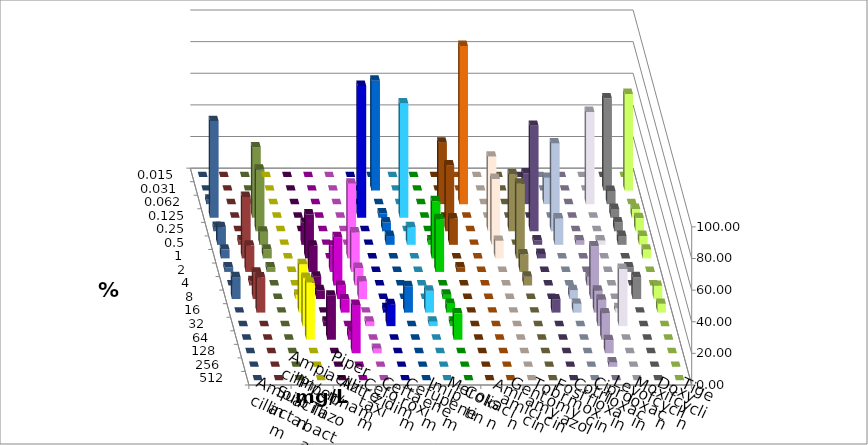
| Category | Ampicillin | Ampicillin/ Sulbactam | Piperacillin | Piperacillin/ Tazobactam | Aztreonam | Cefotaxim | Ceftazidim | Cefuroxim | Imipenem | Meropenem | Colistin | Amikacin | Gentamicin | Tobramycin | Fosfomycin | Cotrimoxazol | Ciprofloxacin | Levofloxacin | Moxifloxacin | Doxycyclin | Tigecyclin |
|---|---|---|---|---|---|---|---|---|---|---|---|---|---|---|---|---|---|---|---|---|---|
| 0.015 | 0 | 0 | 0 | 0 | 0 | 0 | 0 | 0 | 0 | 0 | 0 | 0 | 0 | 0 | 0 | 0 | 0 | 0 | 0 | 0 | 0 |
| 0.031 | 0 | 0 | 0 | 0 | 0 | 69.444 | 0 | 0 | 0 | 0 | 0 | 0 | 0 | 0 | 0 | 0 | 58.333 | 61.111 | 0 | 0 | 0 |
| 0.062 | 0 | 0 | 0 | 0 | 0 | 0 | 0 | 0 | 38.889 | 100 | 0 | 0 | 19.444 | 16.667 | 0 | 58.333 | 8.333 | 0 | 2.778 | 0 | 0 |
| 0.125 | 0 | 0 | 0 | 0 | 83.333 | 2.778 | 72.222 | 0 | 0 | 0 | 0 | 0 | 0 | 0 | 0 | 0 | 5.556 | 5.556 | 61.111 | 0 | 44.444 |
| 0.25 | 0 | 0 | 0 | 0 | 0 | 5.556 | 0 | 0 | 41.667 | 0 | 47.222 | 36.111 | 66.667 | 55.556 | 0 | 0 | 5.556 | 8.333 | 2.778 | 0 | 38.889 |
| 0.5 | 0 | 13.889 | 0 | 0 | 0 | 5.556 | 11.111 | 2.778 | 16.667 | 0 | 41.667 | 0 | 2.778 | 16.667 | 2.778 | 2.778 | 5.556 | 5.556 | 11.111 | 2.778 | 8.333 |
| 1.0 | 0 | 27.778 | 0 | 47.222 | 0 | 0 | 0 | 36.111 | 0 | 0 | 11.111 | 47.222 | 2.778 | 0 | 0 | 0 | 0 | 5.556 | 5.556 | 38.889 | 5.556 |
| 2.0 | 0 | 16.667 | 16.667 | 25 | 0 | 0 | 0 | 33.333 | 2.778 | 0 | 0 | 11.111 | 0 | 0 | 0 | 0 | 2.778 | 0 | 2.778 | 16.667 | 2.778 |
| 4.0 | 0 | 5.556 | 30.556 | 11.111 | 0 | 0 | 0 | 0 | 0 | 0 | 0 | 5.556 | 0 | 0 | 5.556 | 0 | 0 | 0 | 0 | 2.778 | 0 |
| 8.0 | 2.778 | 5.556 | 8.333 | 11.111 | 0 | 0 | 0 | 2.778 | 0 | 0 | 0 | 0 | 0 | 5.556 | 33.333 | 0 | 13.889 | 8.333 | 13.889 | 16.667 | 0 |
| 16.0 | 30.556 | 0 | 8.333 | 0 | 2.778 | 16.667 | 13.889 | 5.556 | 0 | 0 | 0 | 0 | 8.333 | 5.556 | 13.889 | 2.778 | 0 | 5.556 | 0 | 22.222 | 0 |
| 32.0 | 30.556 | 2.778 | 0 | 2.778 | 13.889 | 0 | 2.778 | 2.778 | 0 | 0 | 0 | 0 | 0 | 0 | 16.667 | 36.111 | 0 | 0 | 0 | 0 | 0 |
| 64.0 | 36.111 | 27.778 | 5.556 | 0 | 0 | 0 | 0 | 16.667 | 0 | 0 | 0 | 0 | 0 | 0 | 16.667 | 0 | 0 | 0 | 0 | 0 | 0 |
| 128.0 | 0 | 0 | 30.556 | 2.778 | 0 | 0 | 0 | 0 | 0 | 0 | 0 | 0 | 0 | 0 | 8.333 | 0 | 0 | 0 | 0 | 0 | 0 |
| 256.0 | 0 | 0 | 0 | 0 | 0 | 0 | 0 | 0 | 0 | 0 | 0 | 0 | 0 | 0 | 2.778 | 0 | 0 | 0 | 0 | 0 | 0 |
| 512.0 | 0 | 0 | 0 | 0 | 0 | 0 | 0 | 0 | 0 | 0 | 0 | 0 | 0 | 0 | 0 | 0 | 0 | 0 | 0 | 0 | 0 |